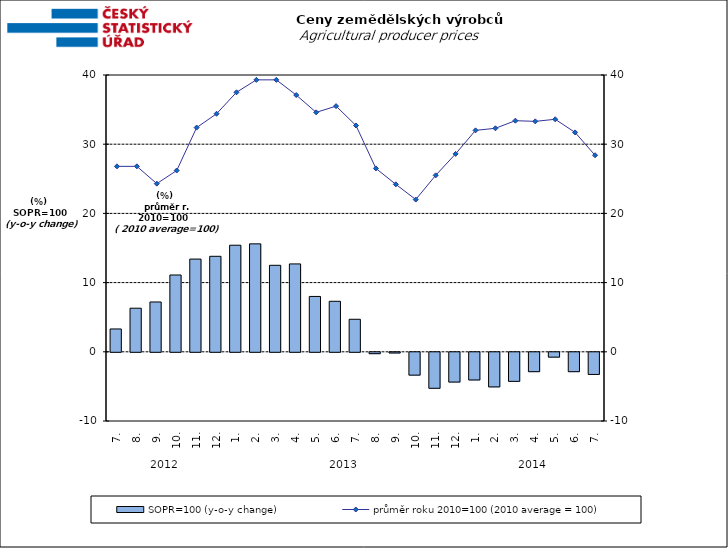
| Category | SOPR=100 (y-o-y change)   |
|---|---|
| 0 | 3.3 |
| 1 | 6.3 |
| 2 | 7.2 |
| 3 | 11.1 |
| 4 | 13.4 |
| 5 | 13.8 |
| 6 | 15.4 |
| 7 | 15.6 |
| 8 | 12.5 |
| 9 | 12.7 |
| 10 | 8 |
| 11 | 7.3 |
| 12 | 4.7 |
| 13 | -0.2 |
| 14 | -0.1 |
| 15 | -3.3 |
| 16 | -5.2 |
| 17 | -4.3 |
| 18 | -4 |
| 19 | -5 |
| 20 | -4.2 |
| 21 | -2.8 |
| 22 | -0.7 |
| 23 | -2.8 |
| 24 | -3.2 |